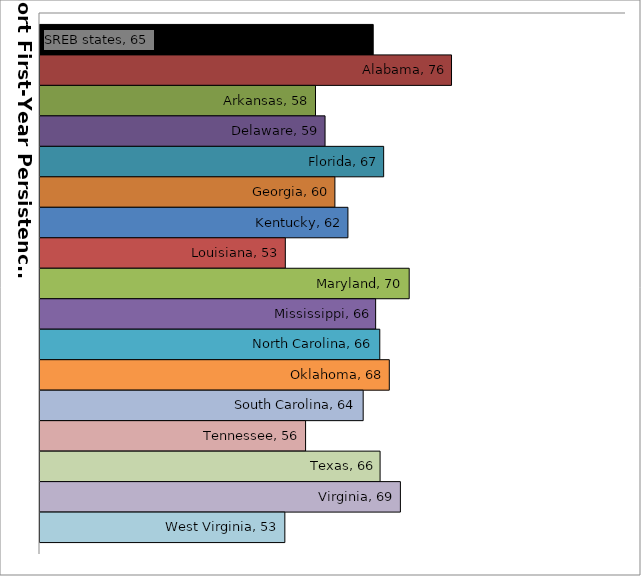
| Category | SREB states | Alabama | Arkansas | Delaware | Florida | Georgia | Kentucky | Louisiana | Maryland | Mississippi | North Carolina | Oklahoma | South Carolina | Tennessee | Texas | Virginia | West Virginia |
|---|---|---|---|---|---|---|---|---|---|---|---|---|---|---|---|---|---|
| 0 | 65.49 | 76.18 | 57.609 | 58.916 | 66.916 | 60.258 | 62.038 | 53.491 | 70.402 | 65.823 | 66.388 | 67.686 | 64.12 | 56.258 | 66.428 | 69.2 | 53.426 |